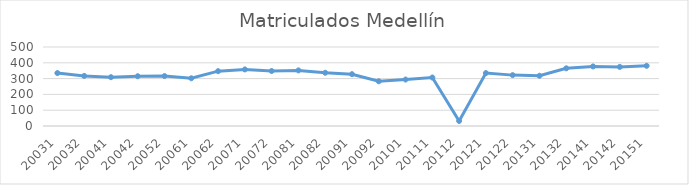
| Category | Matriculados Medellín |
|---|---|
| 20031 | 335 |
| 20032 | 317 |
| 20041 | 309 |
| 20042 | 315 |
| 20052 | 316 |
| 20061 | 302 |
| 20062 | 347 |
| 20071 | 358 |
| 20072 | 348 |
| 20081 | 352 |
| 20082 | 337 |
| 20091 | 328 |
| 20092 | 283 |
| 20101 | 294 |
| 20111 | 307 |
| 20112 | 32 |
| 20121 | 335 |
| 20122 | 322 |
| 20131 | 318 |
| 20132 | 365 |
| 20141 | 377 |
| 20142 | 374 |
| 20151 | 381 |